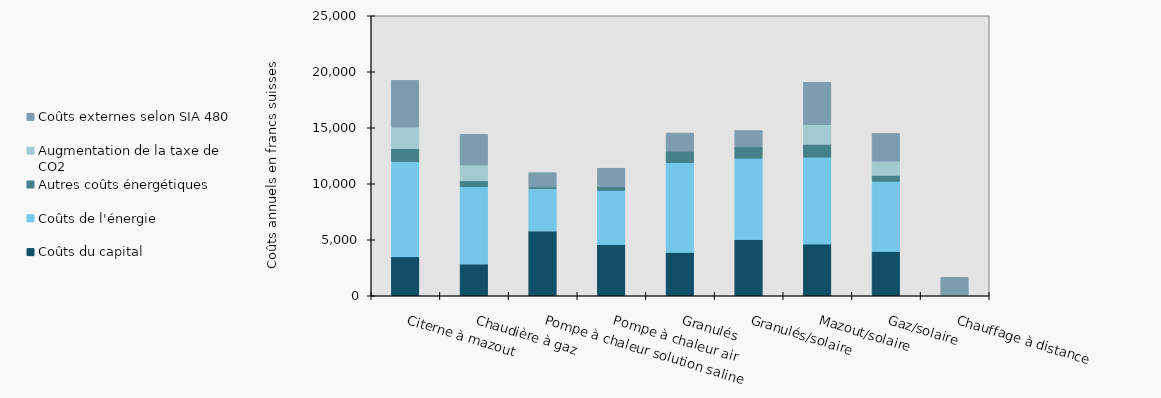
| Category | Coûts du capital | Coûts de l'énergie | Autres coûts énergétiques | Augmentation de la taxe de CO2 | Coûts externes selon SIA 480 |
|---|---|---|---|---|---|
| Citerne à mazout | 3472.538 | 8511.431 | 1153.364 | 1924.7 | 4168.183 |
| Chaudière à gaz | 2829.36 | 6900.296 | 532 | 1413.125 | 2751.001 |
| Pompe à chaleur solution saline | 5779.941 | 3790.265 | 150 | 0 | 1273.612 |
| Pompe à chaleur air | 4568.157 | 4834.627 | 350 | 0 | 1637.501 |
| Granulés | 3870.538 | 8016.077 | 1026.762 | 0 | 1618.236 |
| Granulés/solaire | 5022.176 | 7256.469 | 1019.086 | 0 | 1456.412 |
| Mazout/solaire | 4622.334 | 7759.454 | 1145.793 | 1749.906 | 3789.644 |
| Gaz/solaire | 3958.816 | 6261.267 | 532 | 1271.813 | 2475.901 |
| Chauffage à distance | 0 | 0 | 0 | 0 | 1650.601 |